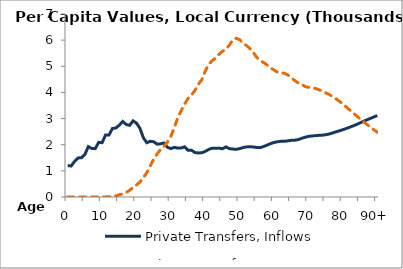
| Category | Private Transfers, Inflows | Private Transfers, Outflows |
|---|---|---|
| 0 | 1202.222 | 0 |
|  | 1185.889 | 0 |
| 2 | 1365.712 | 0 |
| 3 | 1492.797 | 0 |
| 4 | 1503.25 | 0 |
| 5 | 1632.551 | 0 |
| 6 | 1928.337 | 0 |
| 7 | 1856.35 | 0 |
| 8 | 1850.738 | 0.284 |
| 9 | 2089.861 | 1.633 |
| 10 | 2078.487 | 2.699 |
| 11 | 2371.663 | 3.646 |
| 12 | 2373.59 | 8.828 |
| 13 | 2619.713 | 18.849 |
| 14 | 2639.771 | 42.424 |
| 15 | 2748.974 | 87 |
| 16 | 2890.369 | 117.595 |
| 17 | 2774.442 | 170.27 |
| 18 | 2740.281 | 257.231 |
| 19 | 2913.425 | 368.301 |
| 20 | 2825.326 | 464.056 |
| 21 | 2626.917 | 572.925 |
| 22 | 2264.716 | 734.302 |
| 23 | 2075.884 | 933.353 |
| 24 | 2130.704 | 1193.983 |
| 25 | 2113.29 | 1454.57 |
| 26 | 2020.131 | 1646.956 |
| 27 | 2034.995 | 1819.528 |
| 28 | 2066.074 | 1938.104 |
| 29 | 1900.381 | 2105.64 |
| 30 | 1852.294 | 2325.524 |
| 31 | 1900.853 | 2662.856 |
| 32 | 1869.128 | 3033.19 |
| 33 | 1874.166 | 3299.426 |
| 34 | 1919.661 | 3559.832 |
| 35 | 1788.171 | 3771.327 |
| 36 | 1788.645 | 3899.851 |
| 37 | 1699.125 | 4082.864 |
| 38 | 1685.189 | 4312.445 |
| 39 | 1693.269 | 4490.068 |
| 40 | 1745.589 | 4818.768 |
| 41 | 1819.951 | 5075.306 |
| 42 | 1865.097 | 5216.425 |
| 43 | 1868.801 | 5308.622 |
| 44 | 1869.633 | 5460.598 |
| 45 | 1844.85 | 5574.73 |
| 46 | 1918.473 | 5654.051 |
| 47 | 1849.957 | 5808.581 |
| 48 | 1833.871 | 6015.292 |
| 49 | 1824.705 | 6073.048 |
| 50 | 1849.777 | 6013.099 |
| 51 | 1890.825 | 5884.136 |
| 52 | 1916.024 | 5791.723 |
| 53 | 1921.876 | 5675.307 |
| 54 | 1912.522 | 5519.911 |
| 55 | 1892.524 | 5334.872 |
| 56 | 1891.21 | 5213.589 |
| 57 | 1932.711 | 5140.11 |
| 58 | 1987.628 | 5045.4 |
| 59 | 2043.277 | 4936.005 |
| 60 | 2086.023 | 4857.049 |
| 61 | 2113.084 | 4773.111 |
| 62 | 2130.648 | 4746.739 |
| 63 | 2132.04 | 4735.075 |
| 64 | 2146.985 | 4668.447 |
| 65 | 2169.394 | 4556.243 |
| 66 | 2173.011 | 4457.92 |
| 67 | 2194.557 | 4361.35 |
| 68 | 2242.565 | 4318.179 |
| 69 | 2285.915 | 4224.004 |
| 70 | 2316.936 | 4194.787 |
| 71 | 2334.115 | 4175.811 |
| 72 | 2346.96 | 4152.833 |
| 73 | 2357.856 | 4105.89 |
| 74 | 2364.639 | 4047.355 |
| 75 | 2381.293 | 3987.643 |
| 76 | 2409.829 | 3923.279 |
| 77 | 2449.921 | 3847.163 |
| 78 | 2491.842 | 3756.948 |
| 79 | 2531.571 | 3659.936 |
| 80 | 2574.264 | 3555.872 |
| 81 | 2620.94 | 3444.8 |
| 82 | 2669.194 | 3326.085 |
| 83 | 2720.752 | 3210.902 |
| 84 | 2775.183 | 3100.311 |
| 85 | 2835.933 | 2987.677 |
| 86 | 2895.227 | 2880.815 |
| 87 | 2951.55 | 2775.414 |
| 88 | 3006.756 | 2673.564 |
| 89 | 3061.168 | 2574.933 |
| 90+ | 3115.112 | 2478.374 |